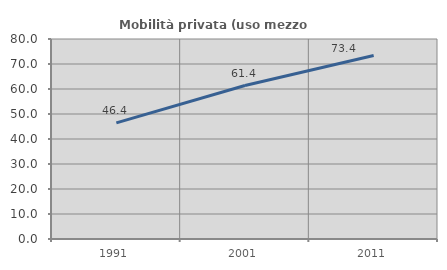
| Category | Mobilità privata (uso mezzo privato) |
|---|---|
| 1991.0 | 46.441 |
| 2001.0 | 61.376 |
| 2011.0 | 73.367 |